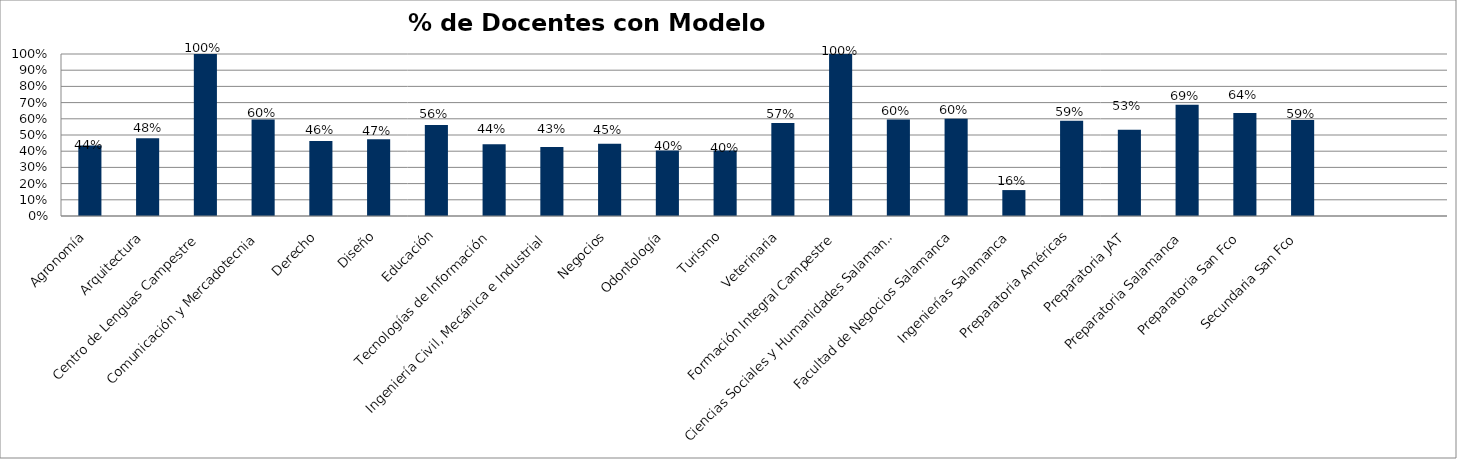
| Category | Series 0 |
|---|---|
| Agronomía | 0.436 |
| Arquitectura | 0.48 |
| Centro de Lenguas Campestre | 1 |
| Comunicación y Mercadotecnia | 0.596 |
| Derecho | 0.463 |
| Diseño | 0.473 |
| Educación | 0.561 |
| Tecnologías de Información | 0.443 |
| Ingeniería Civil, Mecánica e Industrial | 0.425 |
| Negocios | 0.446 |
| Odontología | 0.404 |
| Turismo | 0.404 |
| Veterinaria | 0.574 |
| Formación Integral Campestre | 1 |
| Ciencias Sociales y Humanidades Salamanca | 0.595 |
| Facultad de Negocios Salamanca | 0.6 |
| Ingenierías Salamanca | 0.16 |
| Preparatoria Américas | 0.588 |
| Preparatoria JAT | 0.532 |
| Preparatoria Salamanca | 0.688 |
| Preparatoria San Fco | 0.636 |
| Secundaria San Fco | 0.592 |